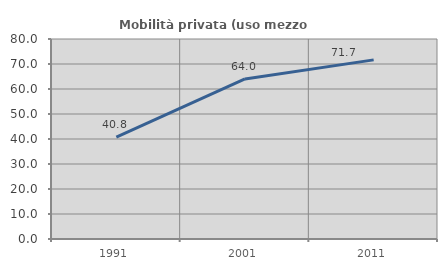
| Category | Mobilità privata (uso mezzo privato) |
|---|---|
| 1991.0 | 40.794 |
| 2001.0 | 64.027 |
| 2011.0 | 71.651 |